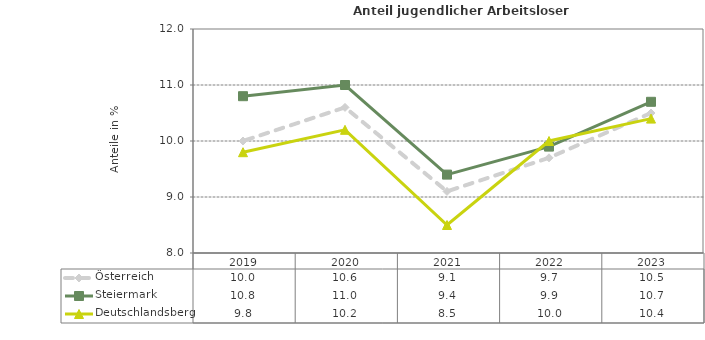
| Category | Österreich | Steiermark | Deutschlandsberg |
|---|---|---|---|
| 2023.0 | 10.5 | 10.7 | 10.4 |
| 2022.0 | 9.7 | 9.9 | 10 |
| 2021.0 | 9.1 | 9.4 | 8.5 |
| 2020.0 | 10.6 | 11 | 10.2 |
| 2019.0 | 10 | 10.8 | 9.8 |